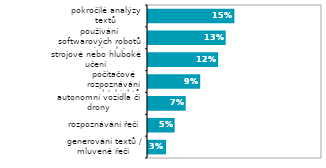
| Category | Series 0 |
|---|---|
| generování textů / mluvené řeči | 0.031 |
| rozpoznávání řeči | 0.046 |
| autonomní vozidla či drony | 0.065 |
| počítačové rozpoznávání osob/objektů | 0.09 |
| strojové nebo hluboké učení | 0.121 |
| používání softwarových robotů pro práci s daty | 0.134 |
| pokročilé analýzy textů | 0.149 |